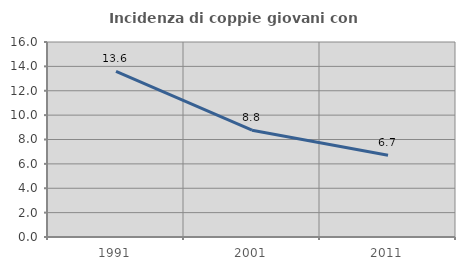
| Category | Incidenza di coppie giovani con figli |
|---|---|
| 1991.0 | 13.585 |
| 2001.0 | 8.766 |
| 2011.0 | 6.707 |